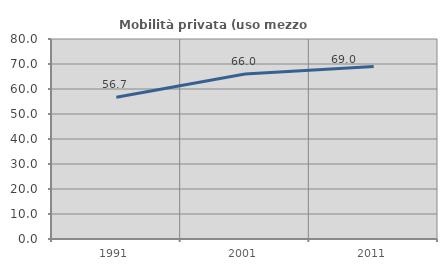
| Category | Mobilità privata (uso mezzo privato) |
|---|---|
| 1991.0 | 56.706 |
| 2001.0 | 66.04 |
| 2011.0 | 69.04 |